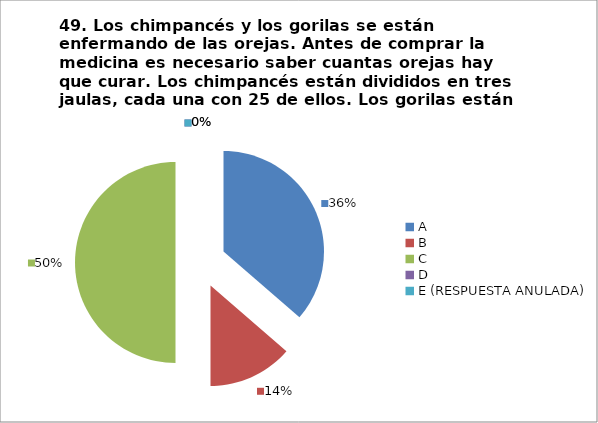
| Category | CANTIDAD DE RESPUESTAS PREGUNTA (49) | PORCENTAJE |
|---|---|---|
| A | 8 | 0.364 |
| B | 3 | 0.136 |
| C | 11 | 0.5 |
| D | 0 | 0 |
| E (RESPUESTA ANULADA) | 0 | 0 |